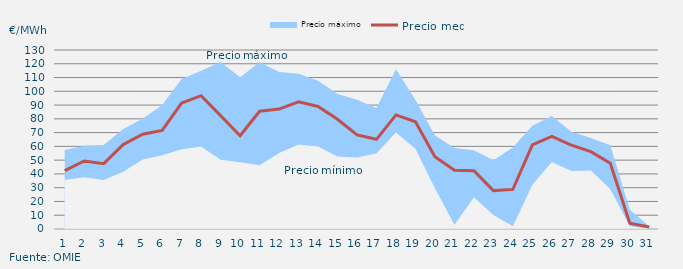
| Category | Precio medio |
|---|---|
| 1 | 42.379 |
| 2 | 49.376 |
| 3 | 47.434 |
| 4 | 61.31 |
| 5 | 68.813 |
| 6 | 71.565 |
| 7 | 91.435 |
| 8 | 96.855 |
| 9 | 82.363 |
| 10 | 67.734 |
| 11 | 85.559 |
| 12 | 87.1 |
| 13 | 92.338 |
| 14 | 89.005 |
| 15 | 79.655 |
| 16 | 68.314 |
| 17 | 65.118 |
| 18 | 82.863 |
| 19 | 77.86 |
| 20 | 52.522 |
| 21 | 42.64 |
| 22 | 42.268 |
| 23 | 27.89 |
| 24 | 28.769 |
| 25 | 61.017 |
| 26 | 67.189 |
| 27 | 60.859 |
| 28 | 56.191 |
| 29 | 47.795 |
| 30 | 4.199 |
| 31 | 1.474 |